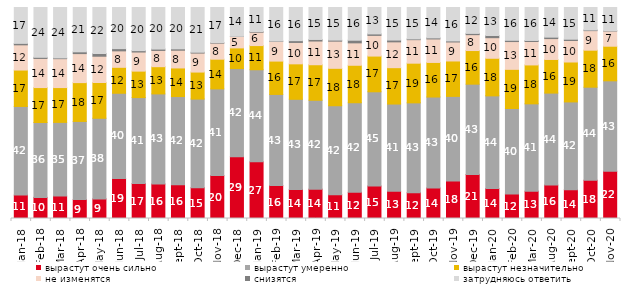
| Category | вырастут очень сильно | вырастут умеренно | вырастут незначительно | не изменятся | снизятся | затрудняюсь ответить |
|---|---|---|---|---|---|---|
| 2018-01-01 | 11.1 | 42 | 17.25 | 11.95 | 0.7 | 17 |
| 2018-02-01 | 10 | 35.5 | 16.55 | 13.8 | 0.55 | 23.6 |
| 2018-03-01 | 10.65 | 34.9 | 16.5 | 13.7 | 0.35 | 23.9 |
| 2018-04-01 | 8.95 | 37.05 | 18.4 | 13.75 | 0.85 | 21 |
| 2018-05-01 | 9.3 | 38.2 | 16.95 | 12.45 | 1.3 | 21.8 |
| 2018-06-01 | 18.95 | 40.4 | 12.3 | 7.8 | 1.05 | 19.5 |
| 2018-07-01 | 16.55 | 40.75 | 12.55 | 9.05 | 0.65 | 20.45 |
| 2018-08-01 | 16.35 | 42.7 | 12.9 | 7.7 | 0.65 | 19.7 |
| 2018-09-01 | 16.05 | 41.75 | 13.55 | 8.4 | 0.65 | 19.6 |
| 2018-10-01 | 14.6 | 42 | 12.8 | 9 | 0.4 | 21.2 |
| 2018-11-01 | 20.359 | 41.068 | 14.072 | 7.585 | 0.25 | 16.667 |
| 2018-12-01 | 29.25 | 41.8 | 9.8 | 5.4 | 0.1 | 13.65 |
| 2019-01-01 | 26.85 | 43.65 | 11.45 | 6.35 | 0.3 | 11.4 |
| 2019-02-01 | 15.6 | 43.2 | 15.8 | 9.35 | 0.15 | 15.9 |
| 2019-03-01 | 13.774 | 42.715 | 16.808 | 10.144 | 0.845 | 15.714 |
| 2019-04-01 | 13.911 | 42.129 | 16.832 | 11.238 | 0.743 | 15.149 |
| 2019-05-01 | 11.293 | 42.15 | 17.732 | 12.878 | 0.495 | 15.453 |
| 2019-06-01 | 12.419 | 42.444 | 17.756 | 10.623 | 1.247 | 15.511 |
| 2019-07-01 | 15.396 | 44.653 | 16.931 | 9.802 | 0.693 | 12.525 |
| 2019-08-01 | 12.887 | 41.359 | 17.233 | 12.238 | 0.849 | 15.435 |
| 2019-09-01 | 12.228 | 42.574 | 18.812 | 11.139 | 0.347 | 14.901 |
| 2019-10-01 | 14.455 | 43.119 | 16.386 | 11.139 | 0.495 | 14.406 |
| 2019-11-01 | 17.772 | 40.099 | 16.782 | 9.01 | 0.495 | 15.842 |
| 2019-12-01 | 20.891 | 42.772 | 15.941 | 7.525 | 0.594 | 12.277 |
| 2020-01-01 | 14.208 | 43.911 | 17.822 | 9.752 | 1.04 | 13.267 |
| 2020-02-01 | 11.634 | 40.495 | 18.564 | 13.168 | 0.594 | 15.545 |
| 2020-03-01 | 12.94 | 41.398 | 18.443 | 11.106 | 0.496 | 15.617 |
| 2020-08-01 | 15.839 | 43.595 | 15.938 | 9.881 | 0.695 | 14.052 |
| 2020-09-01 | 13.639 | 41.613 | 18.915 | 10.204 | 0.597 | 15.032 |
| 2020-10-01 | 18.137 | 44.096 | 17.539 | 9.268 | 0.299 | 10.663 |
| 2020-11-01 | 22.4 | 42.85 | 16.4 | 7.2 | 0.15 | 11 |